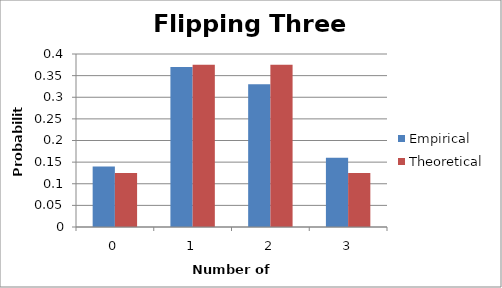
| Category | Empirical | Theoretical |
|---|---|---|
| 0.0 | 0.14 | 0.125 |
| 1.0 | 0.37 | 0.375 |
| 2.0 | 0.33 | 0.375 |
| 3.0 | 0.16 | 0.125 |